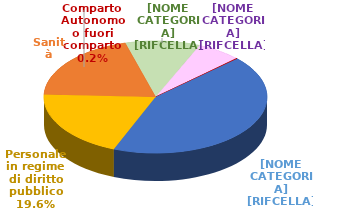
| Category | Series 0 |
|---|---|
| Istruzione e Ricerca | 31068 |
| Personale in regime di diritto pubblico | 14156 |
| Sanità | 14378 |
| Funzioni Locali | 7830 |
| Funzioni Centrali | 4632 |
| Comparto Autonomo o fuori comparto | 144 |